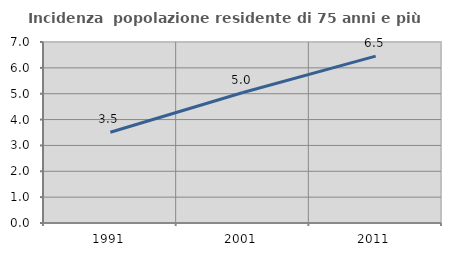
| Category | Incidenza  popolazione residente di 75 anni e più |
|---|---|
| 1991.0 | 3.51 |
| 2001.0 | 5.045 |
| 2011.0 | 6.455 |